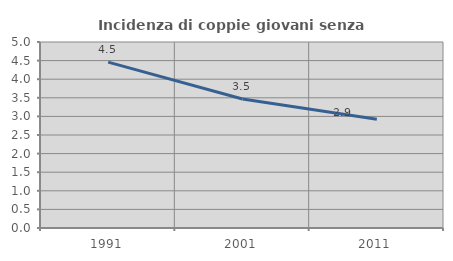
| Category | Incidenza di coppie giovani senza figli |
|---|---|
| 1991.0 | 4.459 |
| 2001.0 | 3.467 |
| 2011.0 | 2.924 |